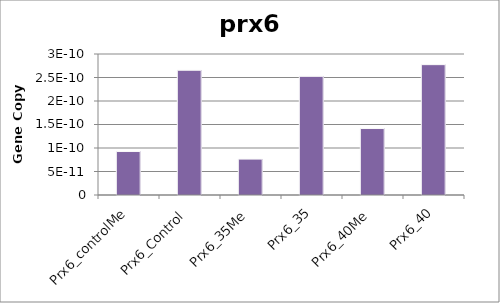
| Category | prx6 |
|---|---|
| Prx6_controlMe | 0 |
| Prx6_Control | 0 |
| Prx6_35Me | 0 |
| Prx6_35 | 0 |
| Prx6_40Me | 0 |
| Prx6_40 | 0 |